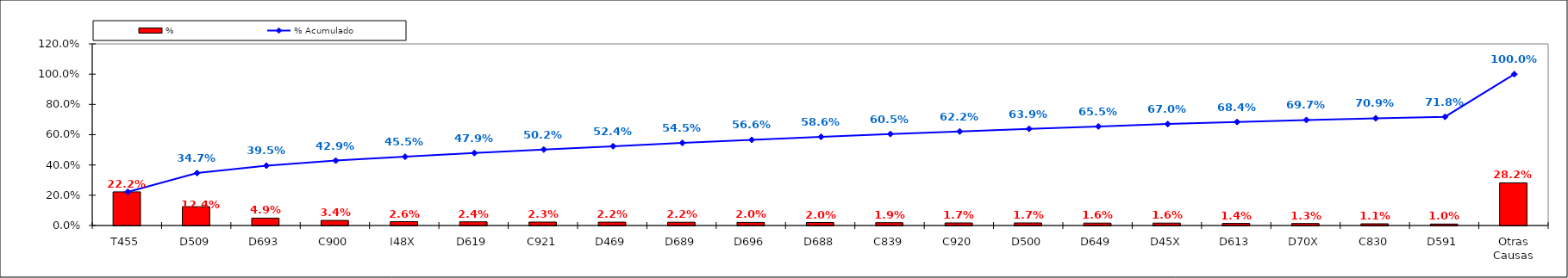
| Category | % |
|---|---|
| T455 | 0.222 |
| D509 | 0.124 |
| D693 | 0.049 |
| C900 | 0.034 |
| I48X | 0.026 |
| D619 | 0.024 |
| C921 | 0.023 |
| D469 | 0.022 |
| D689 | 0.022 |
| D696 | 0.02 |
| D688 | 0.02 |
| C839 | 0.019 |
| C920 | 0.017 |
| D500 | 0.017 |
| D649 | 0.016 |
| D45X | 0.016 |
| D613 | 0.014 |
| D70X | 0.013 |
| C830 | 0.011 |
| D591 | 0.01 |
| Otras Causas | 0.282 |